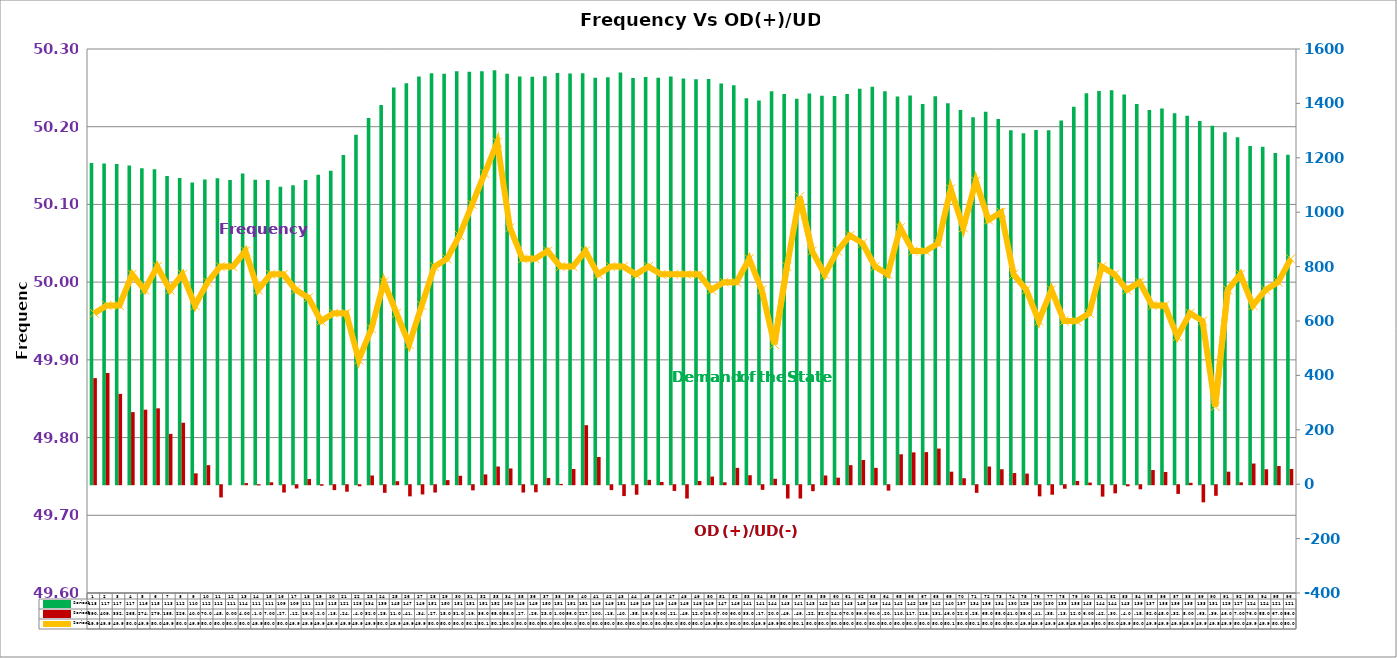
| Category | Series 2 | Series 4 |
|---|---|---|
| 0 | 1181 | 390 |
| 1 | 1179 | 409 |
| 2 | 1177 | 332 |
| 3 | 1172 | 265 |
| 4 | 1162 | 274 |
| 5 | 1158 | 279 |
| 6 | 1133 | 185 |
| 7 | 1126 | 226 |
| 8 | 1109 | 40 |
| 9 | 1120 | 70 |
| 10 | 1125 | -45 |
| 11 | 1118 | 0 |
| 12 | 1142 | 4 |
| 13 | 1119 | -1 |
| 14 | 1118 | 7 |
| 15 | 1094 | -27 |
| 16 | 1099 | -12 |
| 17 | 1118 | 19 |
| 18 | 1138 | -2 |
| 19 | 1152 | -18 |
| 20 | 1210 | -24 |
| 21 | 1285 | -4 |
| 22 | 1346 | 32 |
| 23 | 1394 | -28 |
| 24 | 1458 | 11 |
| 25 | 1474 | -41 |
| 26 | 1499 | -34 |
| 27 | 1511 | -27 |
| 28 | 1509 | 15 |
| 29 | 1518 | 31 |
| 30 | 1516 | -19 |
| 31 | 1518 | 36 |
| 32 | 1522 | 65 |
| 33 | 1509 | 58 |
| 34 | 1499 | -27 |
| 35 | 1498 | -26 |
| 36 | 1500 | 23 |
| 37 | 1512 | 1 |
| 38 | 1510 | 56 |
| 39 | 1511 | 217 |
| 40 | 1494 | 100 |
| 41 | 1496 | -18 |
| 42 | 1514 | -40 |
| 43 | 1493 | -35 |
| 44 | 1497 | 16 |
| 45 | 1494 | 8 |
| 46 | 1499 | -21 |
| 47 | 1492 | -49 |
| 48 | 1489 | 12 |
| 49 | 1490 | 28 |
| 50 | 1473 | 7 |
| 51 | 1467 | 60 |
| 52 | 1419 | 33 |
| 53 | 1411 | -17 |
| 54 | 1445 | 20 |
| 55 | 1435 | -49 |
| 56 | 1417 | -49 |
| 57 | 1436 | -22 |
| 58 | 1428 | 32 |
| 59 | 1427 | 24 |
| 60 | 1435 | 70 |
| 61 | 1454 | 89 |
| 62 | 1461 | 60 |
| 63 | 1445 | -20 |
| 64 | 1425 | 110 |
| 65 | 1429 | 117 |
| 66 | 1398 | 118 |
| 67 | 1426 | 131 |
| 68 | 1401 | 46 |
| 69 | 1376 | 22 |
| 70 | 1349 | -28 |
| 71 | 1369 | 65 |
| 72 | 1343 | 55 |
| 73 | 1301 | 41 |
| 74 | 1290 | 39 |
| 75 | 1302 | -41 |
| 76 | 1301 | -35 |
| 77 | 1337 | -13 |
| 78 | 1388 | 12 |
| 79 | 1437 | 6 |
| 80 | 1446 | -42 |
| 81 | 1448 | -30 |
| 82 | 1433 | -4 |
| 83 | 1398 | -15 |
| 84 | 1376 | 52 |
| 85 | 1381 | 45 |
| 86 | 1364 | -32 |
| 87 | 1355 | 5 |
| 88 | 1335 | -63 |
| 89 | 1318 | -39 |
| 90 | 1294 | 46 |
| 91 | 1276 | 7 |
| 92 | 1243 | 76 |
| 93 | 1241 | 55 |
| 94 | 1218 | 67 |
| 95 | 1211 | 56 |